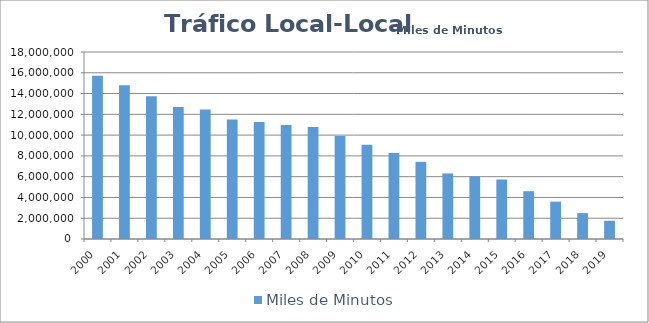
| Category | Miles de Minutos |
|---|---|
| 2000 | 15708021.692 |
| 2001 | 14792112.011 |
| 2002 | 13741512.578 |
| 2003 | 12697840.356 |
| 2004 | 12471681.103 |
| 2005 | 11497364.137 |
| 2006 | 11250082.402 |
| 2007 | 10981107.318 |
| 2008 | 10792163.023 |
| 2009 | 9925576.314 |
| 2010 | 9070767.124 |
| 2011 | 8283065.602 |
| 2012 | 7428037.584 |
| 2013 | 6310456.472 |
| 2014 | 6026527.532 |
| 2015 | 5731826.348 |
| 2016 | 4599625.362 |
| 2017 | 3595888.694 |
| 2018 | 2491247.166 |
| 2019 | 1754617.349 |